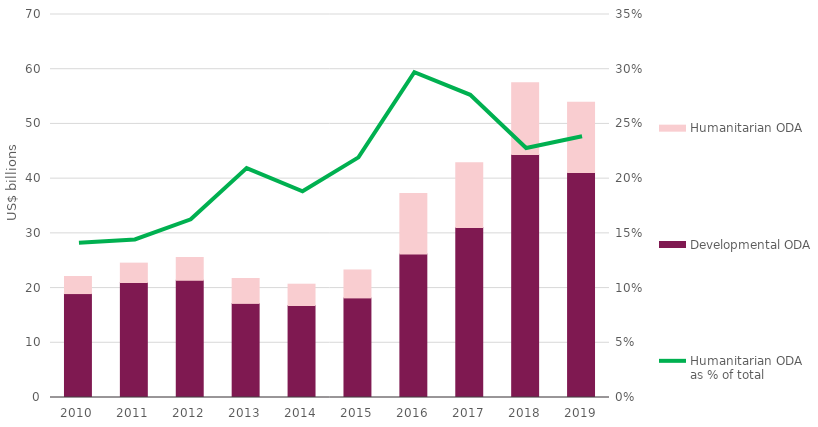
| Category | Developmental ODA | Humanitarian ODA |
|---|---|---|
| 2010.0 | 18.995 | 3.118 |
| 2011.0 | 21.021 | 3.536 |
| 2012.0 | 21.429 | 4.155 |
| 2013.0 | 17.201 | 4.551 |
| 2014.0 | 16.814 | 3.893 |
| 2015.0 | 18.203 | 5.104 |
| 2016.0 | 26.208 | 11.063 |
| 2017.0 | 31.061 | 11.849 |
| 2018.0 | 44.435 | 13.089 |
| 2019.0 | 41.107 | 12.861 |